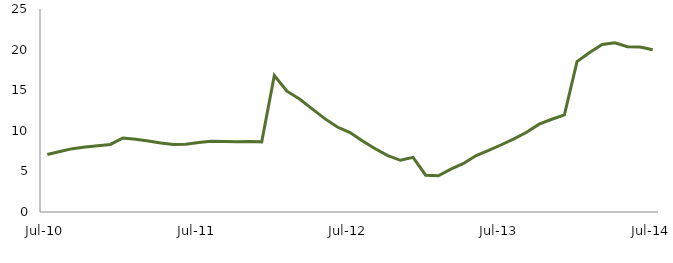
| Category | Series 0 |
|---|---|
| Jul-10 | 7.085 |
|  | 7.448 |
|  | 7.802 |
|  | 8.018 |
|  | 8.154 |
|  | 8.321 |
|  | 9.117 |
|  | 8.961 |
|  | 8.741 |
|  | 8.504 |
|  | 8.316 |
|  | 8.351 |
| Jul-11 | 8.556 |
|  | 8.708 |
|  | 8.67 |
|  | 8.643 |
|  | 8.672 |
|  | 8.638 |
|  | 16.809 |
|  | 14.88 |
|  | 13.91 |
|  | 12.702 |
|  | 11.496 |
|  | 10.465 |
| Jul-12 | 9.782 |
|  | 8.747 |
|  | 7.788 |
|  | 6.94 |
|  | 6.368 |
|  | 6.725 |
|  | 4.528 |
|  | 4.462 |
|  | 5.288 |
|  | 5.982 |
|  | 6.95 |
|  | 7.6 |
| Jul-13 | 8.282 |
|  | 9.007 |
|  | 9.818 |
|  | 10.818 |
|  | 11.424 |
|  | 11.963 |
|  | 18.523 |
|  | 19.632 |
|  | 20.625 |
|  | 20.848 |
|  | 20.351 |
|  | 20.33 |
| Jul-14 | 19.98 |